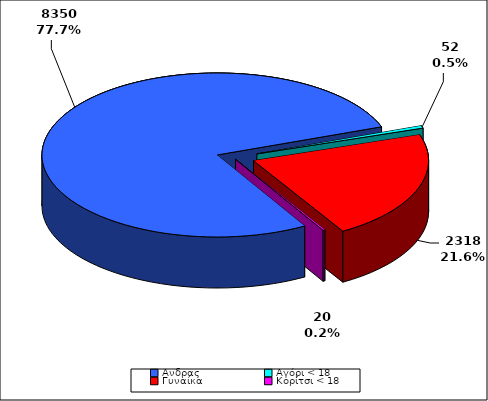
| Category | ΣΥΝΟΛΟ |
|---|---|
| Aνδρας | 8350 |
| Αγόρι < 18 | 52 |
| Γυναίκα | 2318 |
| Κορίτσι < 18 | 20 |